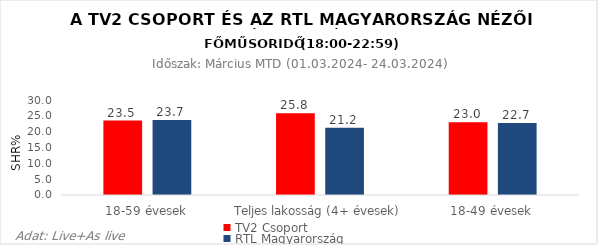
| Category | TV2 Csoport | RTL Magyarország |
|---|---|---|
| 18-59 évesek | 23.5 | 23.7 |
| Teljes lakosság (4+ évesek) | 25.8 | 21.2 |
| 18-49 évesek | 23 | 22.7 |